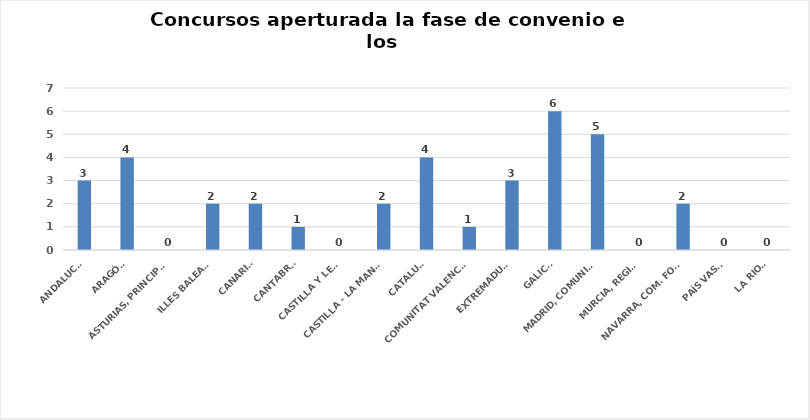
| Category | Series 0 |
|---|---|
| ANDALUCÍA | 3 |
| ARAGÓN | 4 |
| ASTURIAS, PRINCIPADO | 0 |
| ILLES BALEARS | 2 |
| CANARIAS | 2 |
| CANTABRIA | 1 |
| CASTILLA Y LEÓN | 0 |
| CASTILLA - LA MANCHA | 2 |
| CATALUÑA | 4 |
| COMUNITAT VALENCIANA | 1 |
| EXTREMADURA | 3 |
| GALICIA | 6 |
| MADRID, COMUNIDAD | 5 |
| MURCIA, REGIÓN | 0 |
| NAVARRA, COM. FORAL | 2 |
| PAÍS VASCO | 0 |
| LA RIOJA | 0 |